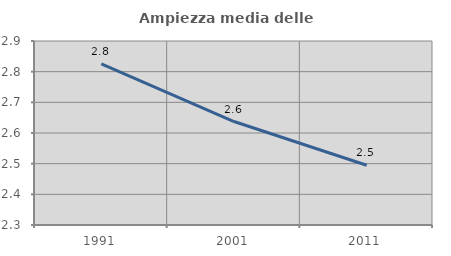
| Category | Ampiezza media delle famiglie |
|---|---|
| 1991.0 | 2.826 |
| 2001.0 | 2.637 |
| 2011.0 | 2.495 |